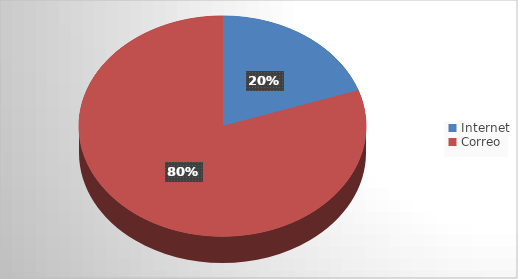
| Category | Series 0 |
|---|---|
| Internet | 14 |
| Correo | 57 |